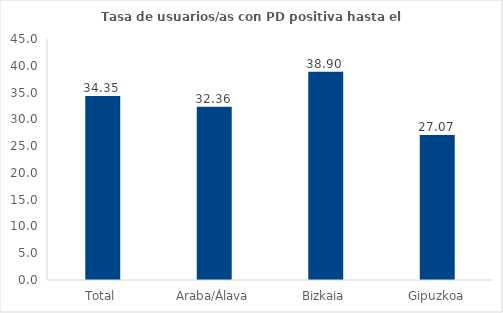
| Category | Series 0 |
|---|---|
| Total | 34.355 |
| Araba/Álava | 32.359 |
| Bizkaia | 38.903 |
| Gipuzkoa | 27.073 |